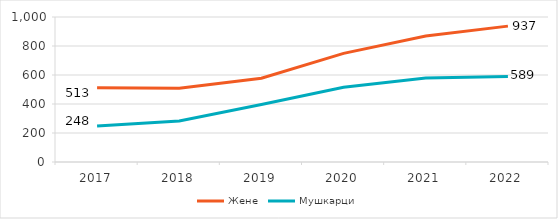
| Category | Жене | Мушкарци |
|---|---|---|
| 2017.0 | 512.833 | 248 |
| 2018.0 | 508.333 | 282.25 |
| 2019.0 | 577.75 | 396.083 |
| 2020.0 | 749 | 515 |
| 2021.0 | 869 | 579 |
| 2022.0 | 937 | 589 |